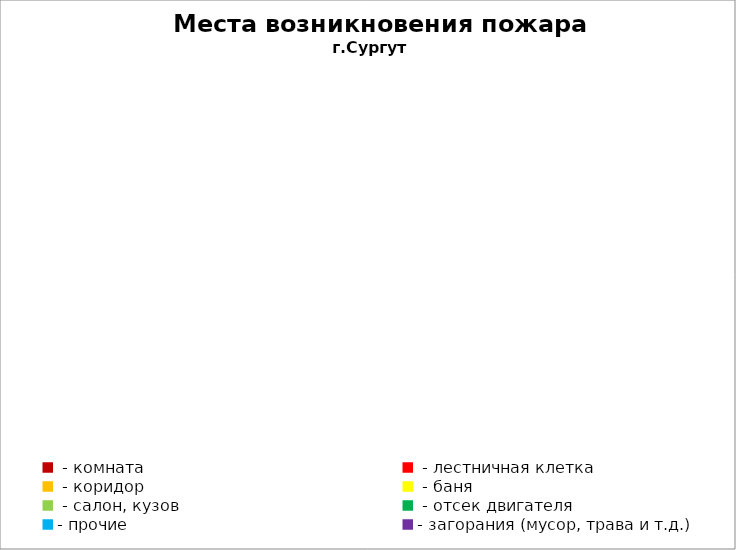
| Category | Места возникновения пожара |
|---|---|
|  - комната | 24 |
|  - лестничная клетка | 3 |
|  - коридор | 5 |
|  - баня | 6 |
|  - салон, кузов | 9 |
|  - отсек двигателя | 27 |
| - прочие | 70 |
| - загорания (мусор, трава и т.д.)  | 44 |